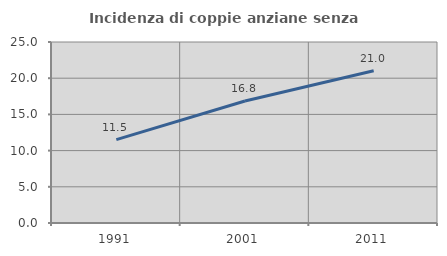
| Category | Incidenza di coppie anziane senza figli  |
|---|---|
| 1991.0 | 11.507 |
| 2001.0 | 16.847 |
| 2011.0 | 21.037 |